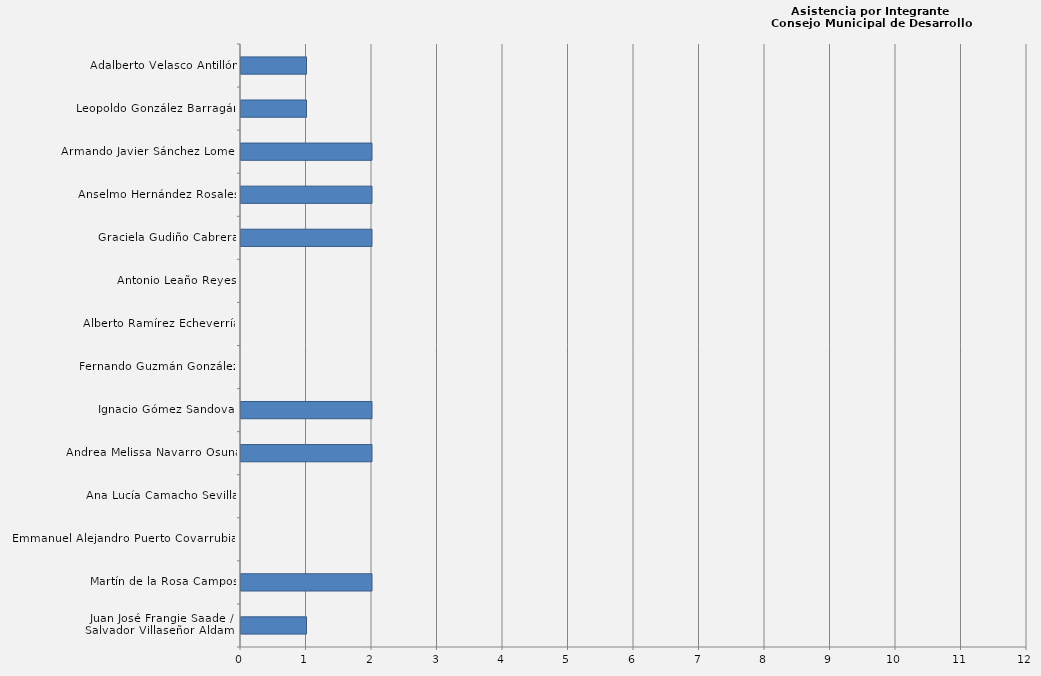
| Category | Series 0 |
|---|---|
| Juan José Frangie Saade /
Salvador Villaseñor Aldama | 1 |
| Martín de la Rosa Campos | 2 |
| Emmanuel Alejandro Puerto Covarrubias | 0 |
| Ana Lucía Camacho Sevilla | 0 |
| Andrea Melissa Navarro Osuna | 2 |
| Ignacio Gómez Sandoval | 2 |
| Fernando Guzmán González | 0 |
| Alberto Ramírez Echeverría | 0 |
| Antonio Leaño Reyes | 0 |
| Graciela Gudiño Cabrera | 2 |
| Anselmo Hernández Rosales | 2 |
| Armando Javier Sánchez Lomelí | 2 |
| Leopoldo González Barragán | 1 |
| Adalberto Velasco Antillón | 1 |